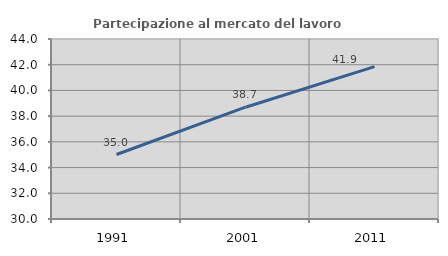
| Category | Partecipazione al mercato del lavoro  femminile |
|---|---|
| 1991.0 | 35.014 |
| 2001.0 | 38.694 |
| 2011.0 | 41.853 |